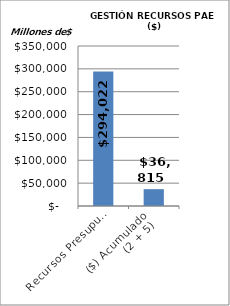
| Category | RECURSOS PAE ($) |
|---|---|
| Recursos Presupuestados | 294022.197 |
| ($) Acumulado
(2 + 5) | 36814.572 |